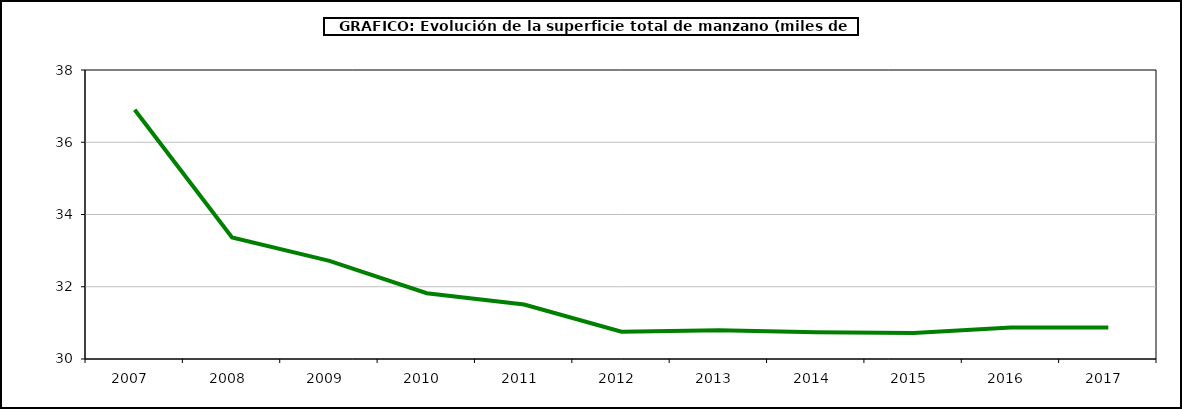
| Category | superficie manzano |
|---|---|
| 2007.0 | 36.902 |
| 2008.0 | 33.362 |
| 2009.0 | 32.715 |
| 2010.0 | 31.822 |
| 2011.0 | 31.507 |
| 2012.0 | 30.753 |
| 2013.0 | 30.794 |
| 2014.0 | 30.739 |
| 2015.0 | 30.721 |
| 2016.0 | 30.872 |
| 2017.0 | 30.872 |